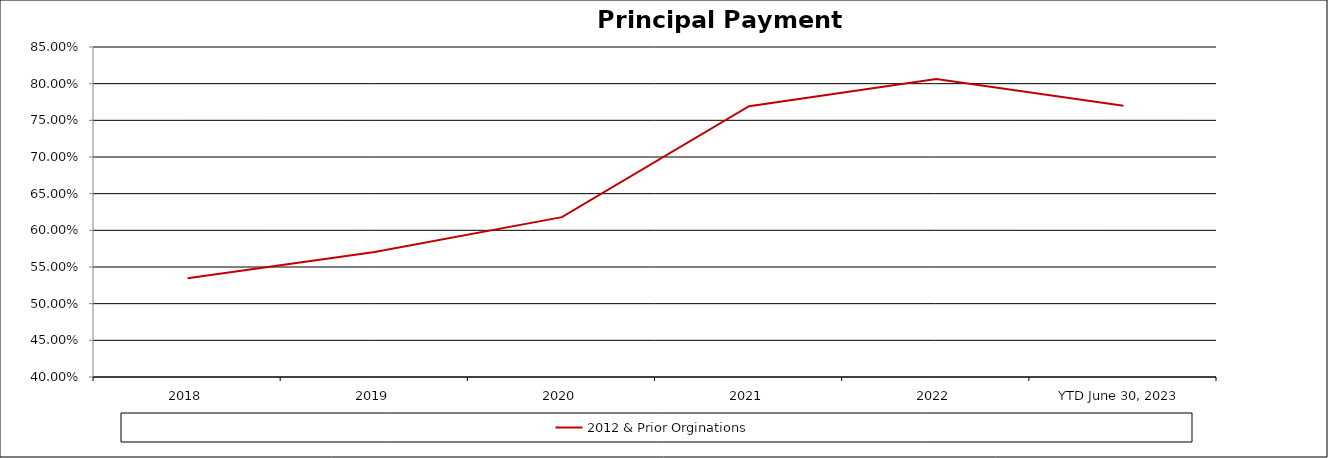
| Category | 2012 & Prior Orginations |
|---|---|
| 2018 | 0.535 |
| 2019 | 0.57 |
| 2020 | 0.618 |
| 2021 | 0.769 |
| 2022 | 0.806 |
| YTD June 30, 2023 | 0.77 |